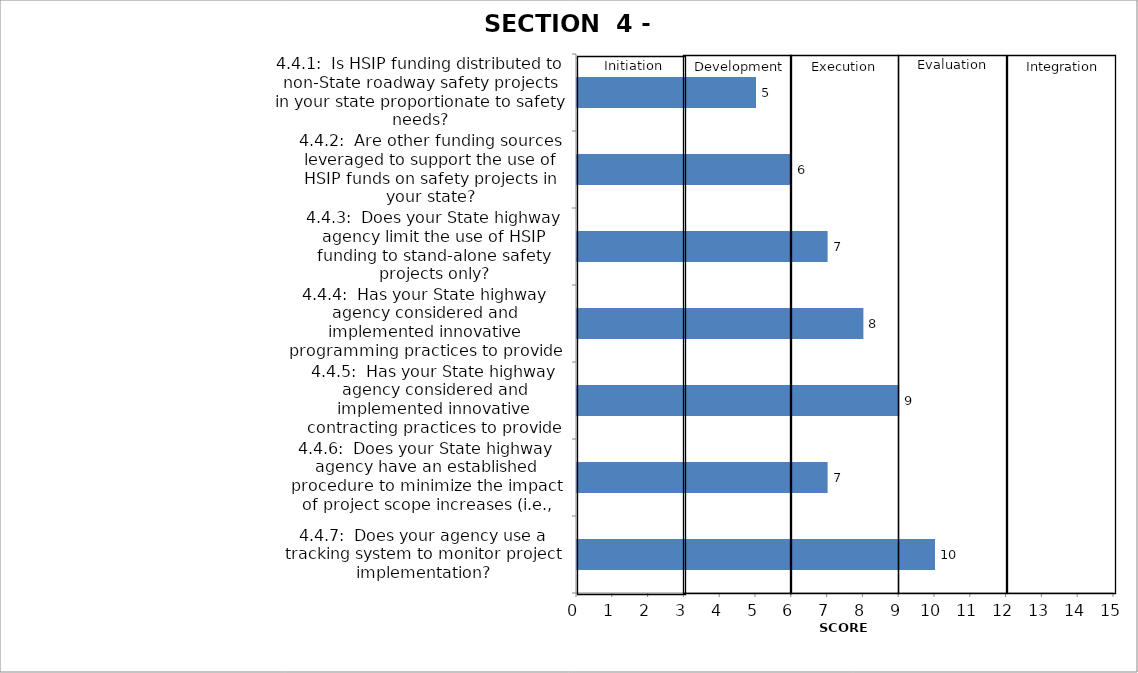
| Category | Series 0 |
|---|---|
| 4.4.1:  Is HSIP funding distributed to non-State roadway safety projects in your state proportionate to safety needs? | 5 |
| 4.4.2:  Are other funding sources leveraged to support the use of HSIP funds on safety projects in your state? | 6 |
| 4.4.3:  Does your State highway agency limit the use of HSIP funding to stand-alone safety projects only? | 7 |
| 4.4.4:  Has your State highway agency considered and implemented innovative programming practices to provide time and cost savings to HSIP-funded projects? | 8 |
| 4.4.5:  Has your State highway agency considered and implemented innovative contracting practices to provide time and cost savings to HSIP-funded projects? | 9 |
| 4.4.6:  Does your State highway agency have an established procedure to minimize the impact of project scope increases (i.e., scope creep) on HSIP projects? | 7 |
| 4.4.7:  Does your agency use a tracking system to monitor project implementation? | 10 |